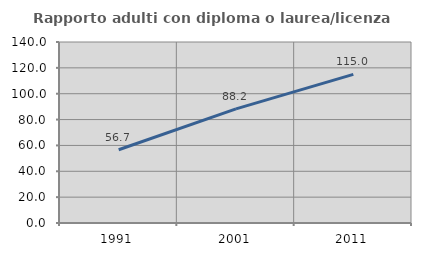
| Category | Rapporto adulti con diploma o laurea/licenza media  |
|---|---|
| 1991.0 | 56.667 |
| 2001.0 | 88.235 |
| 2011.0 | 115 |